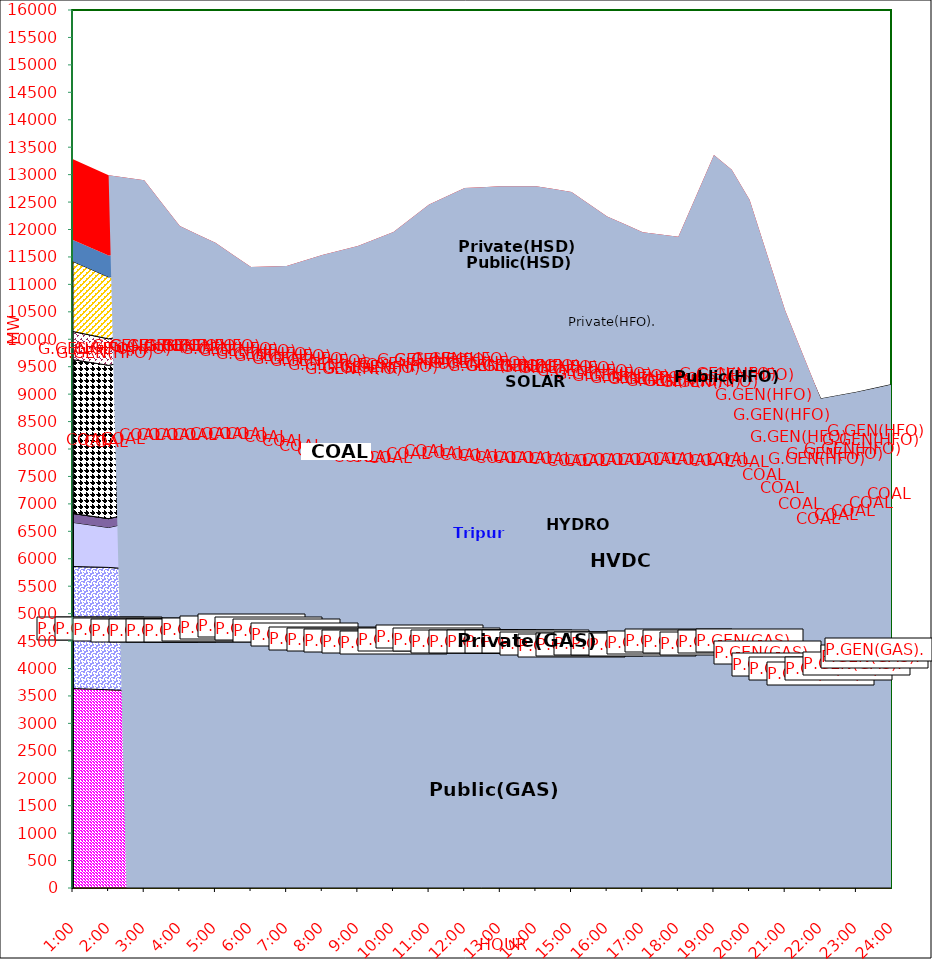
| Category | GAS | P.GEN(GAS). |  HVDC | TRIPURA | HYDRO | COAL | SOLAR | G.GEN(HFO) | P.GEN(HFO). | G.GEN(HSD) | P.GEN(HSD) | SHORTAGE | Total Energy Gen 268.737 MKWHr 
Energy Not Served   17.992 MKWHr 
Energy Requirement     286.730 MKWHr  |
|---|---|---|---|---|---|---|---|---|---|---|---|---|---|
| 1:00 | 3635 | 2224 | 803 | 162 | 0 | 2804 | 0 | 513 | 1276 | 0 | 393 | 1470.7 |  |
| 1:30 | 3624 | 2226.5 | 765 | 162 | 0 | 2799 | 0 | 497.5 | 1202 | 0 | 393 | 1465.447 |  |
| 2:00 | 3613 | 2229 | 727 | 162 | 0 | 2794 | 0 | 482 | 1128 | 0 | 393 | 1460.195 |  |
| 2:30 | 3600.5 | 2219 | 822.5 | 159 | 0 | 2787.5 | 0 | 479 | 1102.5 | 0 | 392 | 1380.452 |  |
| 3:00 | 3588 | 2209 | 918 | 156 | 0 | 2781 | 0 | 476 | 1077 | 0 | 391 | 1300.71 |  |
| 3:30 | 3586 | 2209.5 | 918 | 154 | 0 | 2787 | 0 | 476 | 1046.5 | 0 | 320 | 982.217 |  |
| 4:00 | 3584 | 2210 | 918 | 152 | 0 | 2793 | 0 | 476 | 1016 | 0 | 249 | 663.725 |  |
| 4:30 | 3587 | 2217.5 | 918 | 152 | 0 | 2794 | 0 | 435 | 956 | 0 | 244.5 | 605.947 |  |
| 5:00 | 3590 | 2225 | 918 | 152 | 0 | 2795 | 0 | 394 | 896 | 0 | 240 | 548.17 |  |
| 5:30 | 3628.5 | 2225.5 | 918 | 145 | 0 | 2728.5 | 5 | 368.5 | 847 | 0 | 175 | 495.645 |  |
| 6:00 | 3667 | 2226 | 918 | 138 | 0 | 2662 | 10 | 343 | 798 | 0 | 110 | 443.12 |  |
| 6:30 | 3626 | 2211.5 | 918 | 139 | 0 | 2654 | 24 | 343 | 822.5 | 0 | 55 | 531.457 |  |
| 7:00 | 3585 | 2197 | 918 | 140 | 0 | 2646 | 38 | 343 | 847 | 0 | 0 | 619.795 |  |
| 7:30 | 3528.5 | 2178.5 | 918 | 138 | 0 | 2617.5 | 104.5 | 343 | 914 | 0 | 0 | 693.33 |  |
| 8:00 | 3472 | 2160 | 918 | 136 | 0 | 2589 | 171 | 343 | 981 | 0 | 0 | 766.865 |  |
| 8:30 | 3457 | 2140.5 | 917.5 | 139 | 0 | 2542 | 176 | 342 | 981.5 | 3 | 0 | 919.665 |  |
| 9:00 | 3442 | 2121 | 917 | 142 | 0 | 2495 | 181 | 341 | 982 | 6 | 0 | 1072.465 |  |
| 9:30 | 3431.5 | 2116 | 917.5 | 144 | 12.5 | 2468 | 221 | 349 | 1076 | 23 | 70 | 999.407 |  |
| 10:00 | 3421 | 2111 | 918 | 146 | 25 | 2441 | 261 | 357 | 1170 | 40 | 140 | 926.35 |  |
| 10:30 | 3469 | 2117.5 | 918 | 150 | 25 | 2462 | 237 | 373.5 | 1268 | 44.5 | 192.5 | 948.315 |  |
| 11:00 | 3517 | 2124 | 918 | 154 | 25 | 2483 | 213 | 390 | 1366 | 49 | 245 | 970.28 |  |
| 11:30 | 3480 | 2112 | 918 | 157 | 25 | 2490.5 | 261 | 386 | 1390 | 102.5 | 317.5 | 965.027 |  |
| 12:00 | 3443 | 2100 | 918 | 160 | 25 | 2498 | 309 | 382 | 1414 | 156 | 390 | 959.775 |  |
| 12:30 | 3441.5 | 2099 | 918 | 165 | 25 | 2452 | 285.5 | 394 | 1455 | 213 | 387.5 | 936.378 |  |
| 13:00 | 3440 | 2098 | 918 | 170 | 25 | 2406 | 262 | 406 | 1496 | 270 | 385 | 912.98 |  |
| 13:30 | 3440 | 2098 | 918 | 170 | 25 | 2406 | 262 | 406 | 1496 | 270 | 385 | 912.98 |  |
| 14:00 | 3440 | 2098 | 918 | 170 | 25 | 2406 | 262 | 406 | 1496 | 270 | 385 | 912.98 |  |
| 14:30 | 3414 | 2083 | 917.5 | 174 | 25 | 2419.5 | 270.5 | 404 | 1434.5 | 135 | 288 | 1170.83 |  |
| 15:00 | 3388 | 2068 | 917 | 178 | 25 | 2433 | 279 | 402 | 1373 | 0 | 191 | 1428.68 |  |
| 15:30 | 3417.5 | 2044.5 | 917 | 173 | 25 | 2442.5 | 214 | 395 | 1363.5 | 7.5 | 95.5 | 1365.65 |  |
| 16:00 | 3447 | 2021 | 917 | 168 | 25 | 2452 | 149 | 388 | 1354 | 15 | 0 | 1302.62 |  |
| 16:30 | 3423 | 2054.5 | 917 | 165 | 25 | 2444.5 | 113.5 | 391 | 1364 | 13.5 | 0 | 1183.245 |  |
| 17:00 | 3399 | 2088 | 917 | 162 | 25 | 2437 | 78 | 394 | 1374 | 12 | 0 | 1063.87 |  |
| 17:30 | 3431 | 2092 | 917.5 | 163 | 25 | 2384 | 48.5 | 431 | 1544 | 12 | 0 | 861.41 |  |
| 18:00 | 3463 | 2096 | 918 | 164 | 25 | 2331 | 19 | 468 | 1714 | 12 | 0 | 658.95 |  |
| 18:30 | 3443 | 2086 | 918 | 167 | 25 | 2337.5 | 9.5 | 515.5 | 2179 | 13.5 | 116.5 | 801.722 |  |
| 19:00 | 3423 | 2076 | 918 | 170 | 25 | 2344 | 0 | 563 | 2644 | 15 | 233 | 944.495 |  |
| 19:30 | 3450 | 2089 | 845 | 156 | 25 | 2516 | 0 | 596 | 2712 | 15 | 129 | 554.247 |  |
| 20:00 | 3454 | 2103 | 775 | 164 | 25 | 2500 | 0 | 668 | 2689 | 0 | 0 | 164 |  |
| 20:30 | 3282 | 2023.5 | 798.5 | 160 | 25 | 2491 | 0 | 420 | 2175 | 0 | 0 | 157.5 |  |
| 21:00 | 3110 | 1944 | 822 | 156 | 25 | 2482 | 0 | 172 | 1661 | 0 | 0 | 151 |  |
| 21:30 | 3105.5 | 1776.5 | 822 | 158 | 25 | 2255 | 0 | 165.5 | 1335.5 | 0 | 0 | 75.5 |  |
| 22:00 | 3101 | 1609 | 822 | 160 | 25 | 2028 | 0 | 159 | 1010 | 0 | 0 | 0 |  |
| 22:30 | 3160.5 | 1682 | 823 | 94 | 12.5 | 2062 | 0 | 168 | 971.5 | 0 | 0 | 0 |  |
| 23:00 | 3220 | 1755 | 824 | 28 | 0 | 2096 | 0 | 177 | 933 | 0 | 0 | 0 |  |
| 23:30 | 3344 | 1747 | 823.5 | 52 | 0 | 2123 | 0 | 174 | 841 | 0 | 0 | 0 |  |
| 24:00 | 3468 | 1739 | 823 | 76 | 0 | 2150 | 0 | 171 | 749 | 0 | 0 | 0 |  |